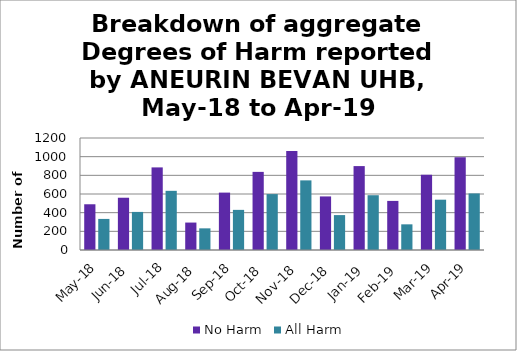
| Category | No Harm | All Harm |
|---|---|---|
| May-18 | 490 | 333 |
| Jun-18 | 560 | 408 |
| Jul-18 | 885 | 634 |
| Aug-18 | 294 | 232 |
| Sep-18 | 615 | 430 |
| Oct-18 | 837 | 599 |
| Nov-18 | 1062 | 746 |
| Dec-18 | 574 | 374 |
| Jan-19 | 899 | 587 |
| Feb-19 | 526 | 275 |
| Mar-19 | 805 | 539 |
| Apr-19 | 994 | 606 |